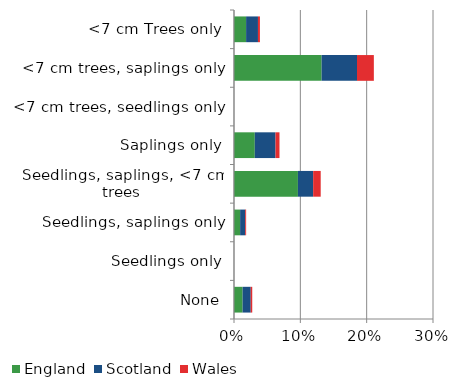
| Category | England | Scotland | Wales |
|---|---|---|---|
| None | 0.013 | 0.012 | 0.002 |
| Seedlings only | 0 | 0 | 0 |
| Seedlings, saplings only | 0.009 | 0.008 | 0.001 |
| Seedlings, saplings, <7 cm trees | 0.096 | 0.023 | 0.011 |
| Saplings only | 0.031 | 0.031 | 0.006 |
| <7 cm trees, seedlings only | 0 | 0 | 0 |
| <7 cm trees, saplings only | 0.132 | 0.053 | 0.025 |
| <7 cm Trees only | 0.018 | 0.018 | 0.003 |